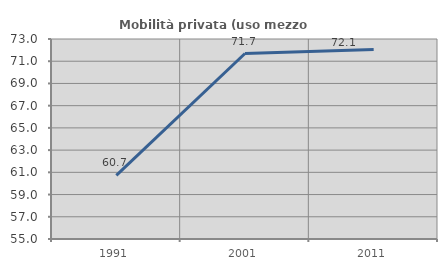
| Category | Mobilità privata (uso mezzo privato) |
|---|---|
| 1991.0 | 60.73 |
| 2001.0 | 71.695 |
| 2011.0 | 72.057 |